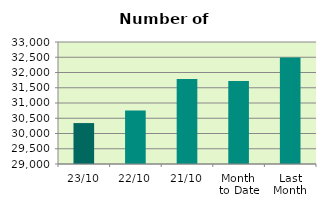
| Category | Series 0 |
|---|---|
| 23/10 | 30342 |
| 22/10 | 30752 |
| 21/10 | 31790 |
| Month 
to Date | 31718 |
| Last
Month | 32492.381 |